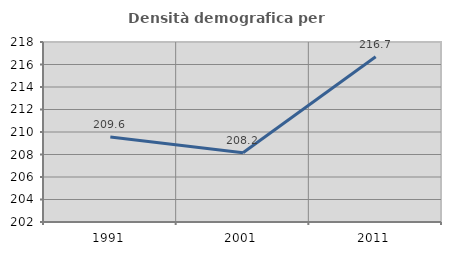
| Category | Densità demografica |
|---|---|
| 1991.0 | 209.566 |
| 2001.0 | 208.162 |
| 2011.0 | 216.691 |